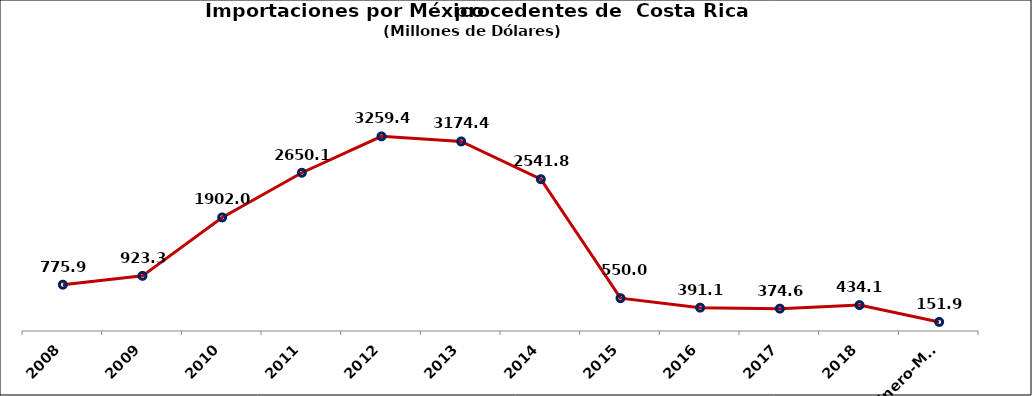
| Category | Series 0 |
|---|---|
| 2008 | 775.885 |
| 2009 | 923.322 |
| 2010 | 1901.953 |
| 2011 | 2650.121 |
| 2012 | 3259.364 |
| 2013 | 3174.391 |
| 2014 | 2541.786 |
| 2015 | 550.02 |
| 2016 | 391.07 |
| 2017 | 374.6 |
| 2018 | 434.1 |
| 2019 Enero-Mayo | 151.9 |